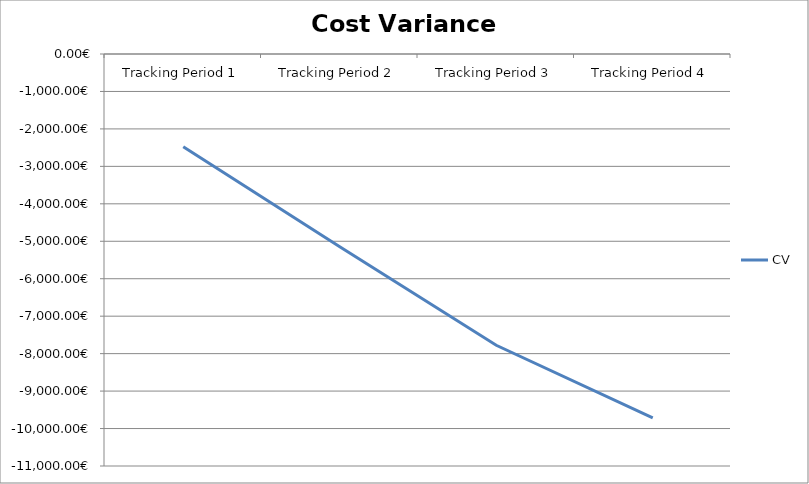
| Category | CV |
|---|---|
| Tracking Period 1 | -2476 |
| Tracking Period 2 | -5148 |
| Tracking Period 3 | -7777 |
| Tracking Period 4 | -9714 |